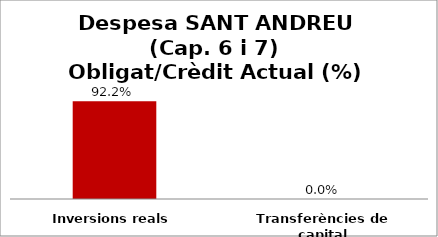
| Category | Series 0 |
|---|---|
| Inversions reals | 0.922 |
| Transferències de capital | 0 |